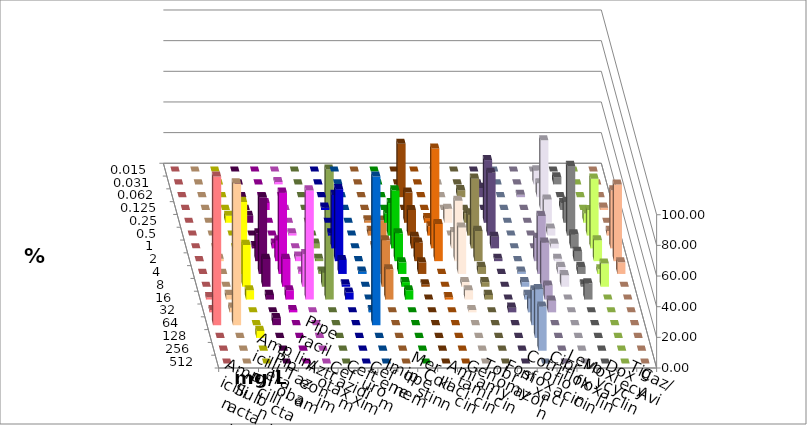
| Category | Ampicillin | Ampicillin/ Sulbactam | Piperacillin | Piperacillin/ Tazobactam | Aztreonam | Cefotaxim | Ceftazidim | Cefuroxim | Imipenem | Meropenem | Colistin | Amikacin | Gentamicin | Tobramycin | Fosfomycin | Cotrimoxazol | Ciprofloxacin | Levofloxacin | Moxifloxacin | Doxycyclin | Tigecyclin | Caz/Avi |
|---|---|---|---|---|---|---|---|---|---|---|---|---|---|---|---|---|---|---|---|---|---|---|
| 0.015 | 0 | 0 | 0 | 0 | 0 | 0 | 0 | 0 | 0 | 0 | 0 | 0 | 0 | 0 | 0 | 0 | 0 | 0 | 0 | 0 | 0 | 0 |
| 0.031 | 0 | 0 | 0 | 0 | 0 | 1.515 | 0 | 0 | 0 | 0 | 0 | 0 | 0 | 0 | 0 | 0 | 9.091 | 4.545 | 0 | 0 | 0 | 0 |
| 0.062 | 0 | 0 | 0 | 0 | 0 | 0 | 0 | 0 | 0 | 34.848 | 0 | 0 | 4.545 | 6.061 | 0 | 1.515 | 9.091 | 0 | 0 | 0 | 0 | 0 |
| 0.125 | 0 | 0 | 0 | 0 | 4.545 | 0 | 1.515 | 0 | 0 | 0 | 0 | 0 | 0 | 0 | 0 | 0 | 45.455 | 4.545 | 0 | 0 | 0 | 1.515 |
| 0.25 | 0 | 0 | 4.545 | 4.545 | 0 | 0 | 0 | 0 | 6.061 | 19.697 | 3.03 | 9.091 | 6.061 | 40.909 | 0 | 0 | 15.152 | 13.636 | 6.061 | 0 | 1.515 | 0 |
| 0.5 | 0 | 0 | 0 | 0 | 0 | 1.515 | 1.515 | 0 | 21.212 | 16.667 | 6.061 | 0 | 13.636 | 40.909 | 0 | 0 | 4.545 | 45.455 | 16.667 | 0 | 3.03 | 3.03 |
| 1.0 | 0 | 0 | 0 | 1.515 | 3.03 | 0 | 34.848 | 0 | 37.879 | 7.576 | 65.152 | 10.606 | 45.455 | 7.576 | 0 | 0 | 3.03 | 9.091 | 45.455 | 3.03 | 1.515 | 37.879 |
| 2.0 | 0 | 1.515 | 10.606 | 18.182 | 13.636 | 3.03 | 46.97 | 0 | 18.182 | 12.121 | 24.242 | 39.394 | 19.697 | 1.515 | 0 | 15.152 | 1.515 | 6.061 | 13.636 | 1.515 | 9.091 | 50 |
| 4.0 | 0 | 0 | 46.97 | 50 | 53.03 | 1.515 | 9.091 | 1.515 | 7.576 | 7.576 | 0 | 30.303 | 4.545 | 0 | 1.515 | 37.879 | 4.545 | 4.545 | 3.03 | 1.515 | 34.848 | 7.576 |
| 8.0 | 0 | 0 | 27.273 | 18.182 | 18.182 | 21.212 | 1.515 | 0 | 3.03 | 1.515 | 0 | 3.03 | 3.03 | 0 | 3.03 | 28.788 | 7.576 | 1.515 | 15.152 | 9.091 | 30.303 | 0 |
| 16.0 | 1.515 | 3.03 | 6.061 | 3.03 | 6.061 | 71.212 | 4.545 | 0 | 6.061 | 0 | 1.515 | 6.061 | 3.03 | 0 | 3.03 | 9.091 | 0 | 10.606 | 0 | 84.848 | 19.697 | 0 |
| 32.0 | 1.515 | 3.03 | 0 | 0 | 1.515 | 0 | 0 | 1.515 | 0 | 0 | 0 | 1.515 | 0 | 3.03 | 9.091 | 7.576 | 0 | 0 | 0 | 0 | 0 | 0 |
| 64.0 | 96.97 | 92.424 | 0 | 4.545 | 0 | 0 | 0 | 96.97 | 0 | 0 | 0 | 0 | 0 | 0 | 22.727 | 0 | 0 | 0 | 0 | 0 | 0 | 0 |
| 128.0 | 0 | 0 | 4.545 | 0 | 0 | 0 | 0 | 0 | 0 | 0 | 0 | 0 | 0 | 0 | 31.818 | 0 | 0 | 0 | 0 | 0 | 0 | 0 |
| 256.0 | 0 | 0 | 0 | 0 | 0 | 0 | 0 | 0 | 0 | 0 | 0 | 0 | 0 | 0 | 28.788 | 0 | 0 | 0 | 0 | 0 | 0 | 0 |
| 512.0 | 0 | 0 | 0 | 0 | 0 | 0 | 0 | 0 | 0 | 0 | 0 | 0 | 0 | 0 | 0 | 0 | 0 | 0 | 0 | 0 | 0 | 0 |